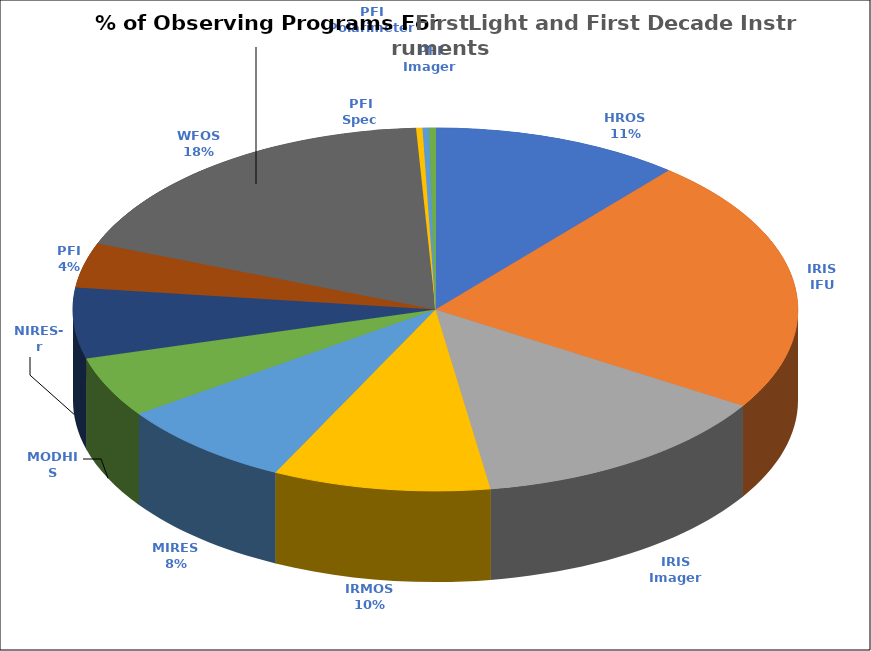
| Category | Total |
|---|---|
| 0 | 39 |
| 1 | 80 |
| 2 | 48 |
| 3 | 34 |
| 4 | 28 |
| 5 | 19 |
| 6 | 22 |
| 7 | 14 |
| 8 | 64 |
| 9 | 1 |
| 10 | 1 |
| 11 | 1 |